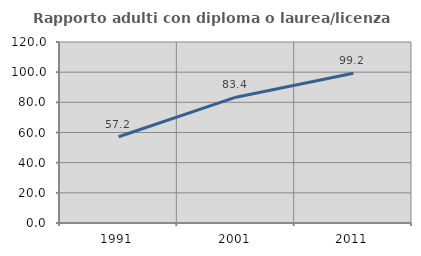
| Category | Rapporto adulti con diploma o laurea/licenza media  |
|---|---|
| 1991.0 | 57.166 |
| 2001.0 | 83.431 |
| 2011.0 | 99.226 |